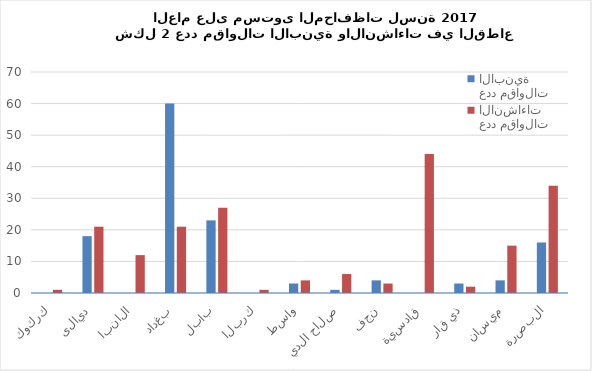
| Category | عدد مقاولات الابنية | عدد مقاولات الانشاءات |
|---|---|---|
| كركوك | 0 | 1 |
| ديالى | 18 | 21 |
| الانبار | 0 | 12 |
| بغداد | 60 | 21 |
| بابل | 23 | 27 |
| كربلاء | 0 | 1 |
| واسط | 3 | 4 |
| صلاح الدين | 1 | 6 |
| نجف | 4 | 3 |
| قادسية | 0 | 44 |
| ذي قار | 3 | 2 |
| ميسان | 4 | 15 |
| البصرة | 16 | 34 |